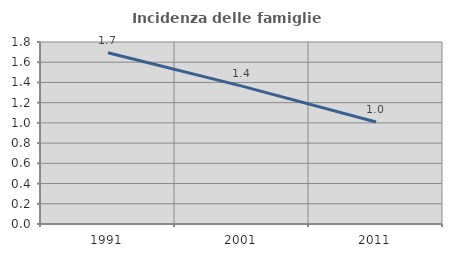
| Category | Incidenza delle famiglie numerose |
|---|---|
| 1991.0 | 1.694 |
| 2001.0 | 1.364 |
| 2011.0 | 1.008 |